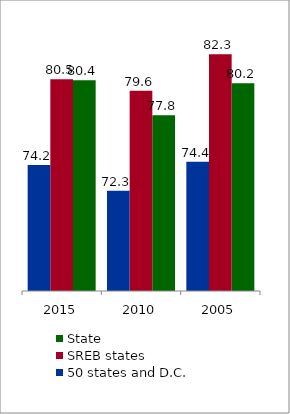
| Category | State | SREB states | 50 states and D.C. |
|---|---|---|---|
| 2005.0 | 80.162 | 82.289 | 74.441 |
| 2010.0 | 77.837 | 79.617 | 72.319 |
| 2015.0 | 80.392 | 80.464 | 74.206 |